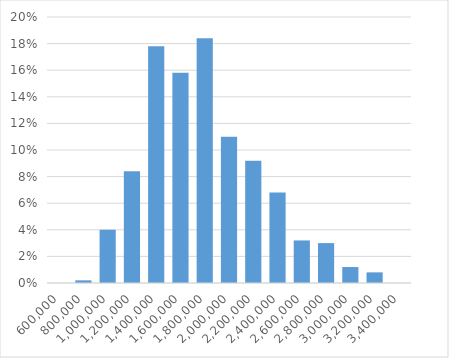
| Category | Series 0 |
|---|---|
| 600000.0 | 0 |
| 800000.0 | 0.002 |
| 1000000.0 | 0.04 |
| 1200000.0 | 0.084 |
| 1400000.0 | 0.178 |
| 1600000.0 | 0.158 |
| 1800000.0 | 0.184 |
| 2000000.0 | 0.11 |
| 2200000.0 | 0.092 |
| 2400000.0 | 0.068 |
| 2600000.0 | 0.032 |
| 2800000.0 | 0.03 |
| 3000000.0 | 0.012 |
| 3200000.0 | 0.008 |
| 3400000.0 | 0 |